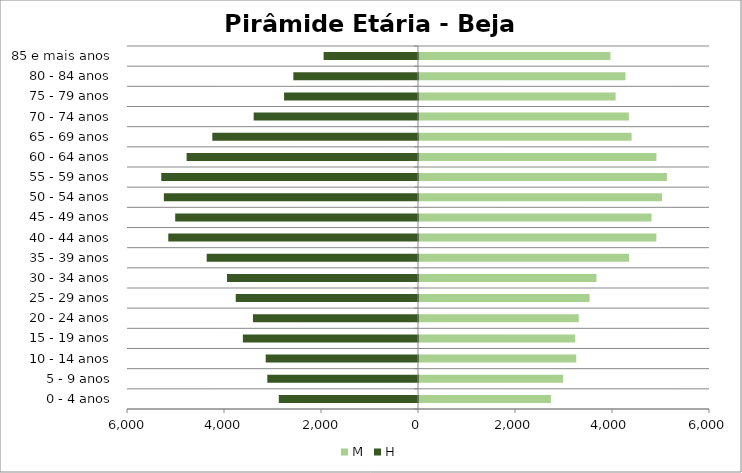
| Category | M | H |
|---|---|---|
| 0 - 4 anos | 2719 | -2870 |
| 5 - 9 anos | 2972 | -3107 |
| 10 - 14 anos | 3243 | -3140 |
| 15 - 19 anos | 3222 | -3611 |
| 20 - 24 anos | 3294 | -3403 |
| 25 - 29 anos | 3517 | -3758 |
| 30 - 34 anos | 3659 | -3938 |
| 35 - 39 anos | 4330 | -4357 |
| 40 - 44 anos | 4894 | -5149 |
| 45 - 49 anos | 4795 | -5006 |
| 50 - 54 anos | 5010 | -5240 |
| 55 - 59 anos | 5111 | -5294 |
| 60 - 64 anos | 4895 | -4771 |
| 65 - 69 anos | 4383 | -4241 |
| 70 - 74 anos | 4327 | -3388 |
| 75 - 79 anos | 4053 | -2761 |
| 80 - 84 anos | 4257 | -2570 |
| 85 e mais anos | 3947 | -1946 |